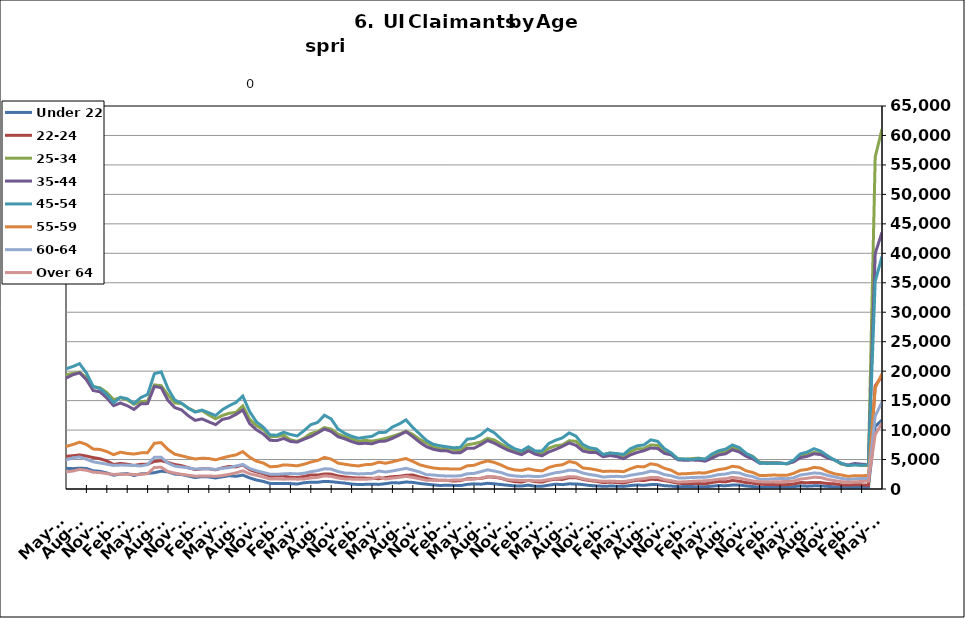
| Category | Under 22 | 22-24 | 25-34 | 35-44 | 45-54 | 55-59 | 60-64 | Over 64 |
|---|---|---|---|---|---|---|---|---|
| 1995-02-28 | 535 | 933 | 5740 | 6206 | 4029 | 1255 | 625 | 276 |
| 1995-03-31 | 534 | 992 | 5856 | 6433 | 4297 | 1294 | 686 | 323 |
| 1995-04-30 | 603 | 1125 | 6814 | 6965 | 4447 | 1392 | 730 | 338 |
| 1995-05-31 | 626 | 1171 | 7442 | 7404 | 4702 | 1383 | 751 | 333 |
| 1995-06-30 | 625 | 1218 | 7514 | 7778 | 4867 | 1435 | 813 | 366 |
| 1995-07-31 | 710 | 1296 | 8612 | 8864 | 5537 | 1595 | 891 | 407 |
| 1995-08-31 | 729 | 1248 | 8185 | 8719 | 5400 | 1604 | 982 | 406 |
| 1995-09-30 | 578 | 1028 | 6615 | 7150 | 4534 | 1351 | 862 | 338 |
| 1995-10-31 | 554 | 957 | 5805 | 6461 | 4159 | 1205 | 741 | 287 |
| 1995-11-30 | 468 | 845 | 5201 | 5826 | 3927 | 1155 | 702 | 254 |
| 1995-12-31 | 517 | 858 | 5350 | 5974 | 4010 | 1153 | 672 | 263 |
| 1996-01-31 | 543 | 927 | 5431 | 6086 | 4208 | 1221 | 685 | 301 |
| 1996-02-29 | 617 | 999 | 5667 | 6535 | 4480 | 1312 | 747 | 305 |
| 1996-03-31 | 622 | 981 | 5896 | 6557 | 4514 | 1362 | 763 | 306 |
| 1996-04-30 | 680 | 1140 | 7032 | 7649 | 5088 | 1527 | 856 | 345 |
| 1996-05-31 | 689 | 1163 | 7220 | 7819 | 5070 | 1521 | 832 | 366 |
| 1996-06-30 | 661 | 1145 | 7344 | 8173 | 5391 | 1568 | 844 | 388 |
| 1996-07-31 | 762 | 1250 | 8375 | 9181 | 6036 | 1755 | 973 | 432 |
| 1996-08-31 | 746 | 1145 | 7829 | 8585 | 5586 | 1651 | 950 | 435 |
| 1996-09-30 | 635 | 992 | 6399 | 7097 | 4790 | 1462 | 804 | 425 |
| 1996-10-31 | 572 | 851 | 5448 | 6291 | 4192 | 1259 | 693 | 340 |
| 1996-11-30 | 531 | 827 | 5003 | 5921 | 3908 | 1153 | 602 | 315 |
| 1996-12-31 | 521 | 789 | 4710 | 5510 | 3673 | 1110 | 610 | 284 |
| 1997-01-31 | 559 | 841 | 5203 | 6172 | 4321 | 1255 | 731 | 328 |
| 1997-02-28 | 556 | 841 | 5187 | 6162 | 4311 | 1250 | 727 | 326 |
| 1997-03-31 | 499 | 806 | 5125 | 6037 | 4176 | 1294 | 702 | 363 |
| 1997-04-30 | 545 | 885 | 5753 | 6709 | 4248 | 1339 | 734 | 339 |
| 1997-05-31 | 612 | 941 | 6146 | 7153 | 4458 | 1348 | 801 | 336 |
| 1997-06-30 | 623 | 995 | 6240 | 7298 | 4662 | 1302 | 776 | 348 |
| 1997-07-31 | 716 | 1154 | 7168 | 8554 | 5489 | 1509 | 903 | 415 |
| 1997-08-31 | 684 | 1072 | 6853 | 8093 | 5222 | 1487 | 837 | 416 |
| 1997-09-30 | 579 | 912 | 5522 | 6592 | 4348 | 1285 | 705 | 380 |
| 1997-10-31 | 516 | 817 | 4894.5 | 5892.5 | 3945 | 1159 | 625 | 344.5 |
| 1997-11-30 | 453 | 722 | 4267 | 5193 | 3542 | 1033 | 545 | 309 |
| 1997-12-31 | 413 | 682 | 3792 | 4755 | 3300 | 1023 | 490 | 266 |
| 1998-01-31 | 489 | 741 | 4044 | 5115 | 3513 | 1099 | 525 | 267 |
| 1998-02-28 | 435 | 684 | 3864 | 4903 | 3549 | 1043 | 571 | 285 |
| 1998-03-31 | 416 | 680 | 3855 | 5086 | 3703 | 1176 | 604 | 297 |
| 1998-04-30 | 592 | 813 | 5092 | 6219 | 4262 | 1336 | 688 | 332 |
| 1998-05-31 | 579 | 849 | 5319 | 6766 | 4554 | 1382 | 729 | 360 |
| 1998-06-30 | 568 | 899 | 5557 | 7101 | 4897 | 1405 | 783 | 367 |
| 1998-07-31 | 691 | 1031 | 6472 | 8095 | 5562 | 1589 | 880 | 392 |
| 1998-08-31 | 673 | 1007 | 6326 | 7950 | 5369 | 1574 | 935 | 393 |
| 1998-09-30 | 548 | 838 | 5206 | 6768 | 4703 | 1432 | 849 | 373 |
| 1998-10-31 | 496 | 776 | 4437 | 5582 | 3875 | 1250 | 711 | 302 |
| 1998-11-30 | 456 | 761 | 4182 | 5332 | 4015 | 1296 | 694 | 308 |
| 1998-12-31 | 442 | 722 | 4010 | 5198 | 4062 | 1331 | 656 | 290 |
| 1999-01-31 | 503 | 830 | 4502 | 5761 | 4521 | 1490 | 751 | 297 |
| 1999-02-28 | 463 | 756 | 4267 | 5576 | 4431 | 1470 | 767 | 301 |
| 1999-03-31 | 435 | 688 | 4119 | 5519 | 4403 | 1516 | 765 | 331 |
| 1999-04-30 | 591 | 949 | 5292 | 7089 | 5468 | 1724 | 914 | 489 |
| 1999-05-31 | 674 | 911 | 5611 | 7459 | 5457 | 1710 | 934 | 500 |
| 1999-06-30 | 640 | 906 | 5660 | 7503 | 5333 | 1695 | 920 | 495 |
| 1999-07-31 | 766 | 1132 | 6820 | 9256 | 6620 | 1981 | 1001 | 549 |
| 1999-08-31 | 738 | 1117 | 6737 | 9030 | 6670 | 2019 | 1075 | 582 |
| 1999-09-30 | 600 | 968 | 5167 | 7169 | 5458 | 1712 | 892 | 465 |
| 1999-10-31 | 494 | 813 | 4501 | 6048 | 4682 | 1443 | 743 | 363 |
| 1999-11-30 | 464 | 768 | 4228 | 5593 | 4564 | 1392 | 702 | 313 |
| 1999-12-31 | 468.5 | 754.5 | 4149 | 5486.5 | 4505 | 1429 | 673 | 304 |
| 2000-01-31 | 473 | 741 | 4070 | 5380 | 4446 | 1466 | 644 | 295 |
| 2000-02-29 | 460 | 691 | 3807 | 5357 | 4470 | 1469 | 707 | 310 |
| 2000-03-31 | 412 | 652 | 3864 | 5499 | 4568 | 1508 | 816 | 389 |
| 2000-04-30 | 585 | 829 | 4741 | 6891 | 5127 | 1631 | 906 | 451 |
| 2000-05-31 | 627 | 875 | 5086 | 7211 | 5238 | 1598 | 956 | 489 |
| 2000-06-30 | 675 | 983 | 5624 | 7826 | 5562 | 1669 | 941 | 524 |
| 2000-07-31 | 802 | 1109 | 6475 | 9102 | 6450 | 1927 | 1097 | 594 |
| 2000-08-31 | 787 | 1058 | 6045 | 8732 | 6157 | 1894 | 1085 | 616 |
| 2000-09-30 | 607 | 897 | 4766 | 6864 | 5037 | 1486 | 902 | 479 |
| 2000-10-31 | 544 | 760 | 4267 | 5897 | 4465 | 1323 | 762 | 394 |
| 2000-11-30 | 535 | 797 | 3982 | 5439 | 4318 | 1256 | 702 | 396 |
| 2000-12-31 | 508 | 832 | 3891 | 5255 | 4218 | 1246 | 694 | 361 |
| 2001-01-31 | 627 | 892 | 4229 | 5724 | 4777 | 1300 | 721 | 393 |
| 2001-02-28 | 643 | 934 | 4553 | 6302 | 5224 | 1529 | 849 | 472 |
| 2001-03-31 | 412 | 648 | 3625 | 5081 | 4551 | 1413 | 778 | 440 |
| 2001-04-30 | 875 | 1276 | 6577 | 8914 | 7196 | 2144 | 1185 | 639 |
| 2001-05-31 | 944 | 1399 | 7133 | 9570 | 7651 | 2265 | 1231 | 679 |
| 2001-06-30 | 1041 | 1584 | 8072 | 11034 | 8621 | 2613 | 1398 | 756 |
| 2001-07-31 | 1135 | 1806 | 9038 | 12514 | 9691 | 2970 | 1611 | 848 |
| 2001-08-31 | 1116 | 1776 | 8753 | 12045 | 9560 | 2963 | 1691 | 898 |
| 2001-09-30 | 1046 | 1705 | 8118 | 11025 | 8788 | 2784 | 1608 | 833 |
| 2001-10-31 | 1094 | 1785 | 8459 | 11114 | 8850 | 2772 | 1610 | 777 |
| 2001-11-30 | 1154 | 1931 | 9131 | 11576 | 9447 | 2973 | 1661 | 778 |
| 2001-12-31 | 1280 | 2191 | 9917 | 11961 | 9905 | 3152 | 1740 | 780 |
| 2002-01-31 | 1330 | 2255 | 10364 | 12730 | 10592 | 3378 | 1843 | 821 |
| 2002-02-28 | 1347 | 2339 | 10349 | 12730 | 10784 | 3499 | 1861 | 867 |
| 2002-03-31 | 1266 | 2231 | 9963 | 12747 | 10614 | 3499 | 1867 | 979 |
| 2002-04-30 | 1412 | 2488 | 11603 | 15825 | 13571 | 4631 | 2389 | 1146 |
| 2002-05-31 | 1455 | 2421 | 11243 | 15509 | 13148 | 4374 | 2359 | 1195 |
| 2002-06-30 | 1534 | 2479 | 11416 | 15594 | 13261 | 4343 | 2365 | 1180 |
| 2002-07-31 | 1513 | 2614 | 11895 | 16242 | 13727 | 4439 | 2428 | 1255 |
| 2002-08-31 | 1022 | 1977 | 8719 | 12054 | 10588 | 3454 | 1990 | 1047 |
| 2002-09-30 | 1391 | 2528 | 10478 | 14010 | 12008 | 3847 | 2161 | 1166 |
| 2002-10-31 | 1401 | 2385 | 9826 | 12727 | 10778 | 3498 | 1886 | 973 |
| 2002-11-30 | 1344 | 2390 | 9846 | 12059 | 10297 | 3367 | 1833 | 958 |
| 2002-12-31 | 1311 | 2403 | 9841 | 11670 | 10177 | 3369 | 1871 | 894 |
| 2003-01-31 | 1311 | 2403 | 9841 | 11670 | 10177 | 3369 | 1871 | 894 |
| 2003-02-28 | 1367 | 2275 | 9730 | 12433 | 10806 | 3687 | 2016 | 974 |
| 2003-03-31 | 1367 | 2357 | 9844 | 12620 | 11167 | 3825 | 2151 | 1094 |
| 2003-04-30 | 1549 | 2525 | 10619 | 14142 | 12182 | 4004 | 2304 | 1190 |
| 2003-05-31 | 1663 | 2698 | 10843 | 14795 | 12539 | 4102 | 2395 | 1256 |
| 2003-06-30 | 1755 | 2770 | 11350 | 15575 | 13251 | 4301 | 2493 | 1325 |
| 2003-07-31 | 1748 | 2791 | 11577 | 15863 | 13772 | 4465 | 2593 | 1371 |
| 2003-08-31 | 1718 | 2653 | 10998 | 15261 | 13219 | 4325 | 2522 | 1359 |
| 2003-09-30 | 1494 | 2521 | 10071 | 13565 | 11659 | 3828 | 2278 | 1286 |
| 2003-10-31 | 1329 | 2432 | 9388 | 12107 | 10693 | 3567 | 2036 | 1129 |
| 2003-11-30 | 1191 | 2226 | 8954 | 11297 | 10037 | 3414 | 2004 | 1068 |
| 2003-12-31 | 1206 | 2184 | 8530 | 10413 | 9335 | 3215 | 1854 | 994 |
| 2004-01-31 | 1216 | 2171 | 8382 | 9858 | 8955 | 2992 | 1736 | 963 |
| 2004-02-29 | 1118 | 1879 | 7614 | 8935 | 8176 | 2761 | 1617 | 943 |
| 2004-03-31 | 1099 | 1749 | 7152 | 8565 | 7769 | 2686 | 1608 | 981 |
| 2004-04-30 | 1241 | 1951 | 7653 | 9981 | 8741 | 2872 | 1685 | 1056 |
| 2004-05-31 | 1245 | 1934 | 7651 | 10203 | 8820 | 2928 | 1703 | 1079 |
| 2004-06-30 | 1316 | 2086 | 8172 | 10636 | 9362 | 3146 | 1843 | 1081 |
| 2004-07-31 | 1476 | 2265 | 8795 | 11511 | 10439 | 3497 | 2008 | 1171 |
| 2004-08-31 | 1390 | 2055 | 8008 | 10418 | 9514 | 3304 | 1909 | 1105 |
| 2004-09-30 | 1129 | 1820 | 6987 | 8661 | 7694 | 2755 | 1623 | 1046 |
| 2004-10-31 | 1037 | 1675 | 6590 | 7964 | 7029 | 2459 | 1461 | 882 |
| 2004-11-30 | 954 | 1638 | 6342 | 7570 | 6733 | 2294 | 1383 | 841 |
| 2004-12-31 | 857 | 1533 | 5921 | 6991 | 6333 | 2225 | 1287 | 764 |
| 2005-01-31 | 893 | 1539 | 6047 | 7410 | 6682 | 2253 | 1274 | 788 |
| 2005-02-28 | 846 | 1361 | 5650 | 6952 | 6404 | 2198 | 1326 | 786 |
| 2005-03-31 | 747 | 1258 | 5313 | 6595 | 6251 | 2151 | 1327 | 742 |
| 2005-04-30 | 877 | 1375 | 5696 | 7717 | 7230 | 2440 | 1401 | 844 |
| 2005-05-31 | 854 | 1408 | 5674 | 7905 | 7454 | 2482 | 1453 | 858 |
| 2005-06-30 | 819 | 1444 | 6028 | 8565 | 7899 | 2613 | 1547 | 890 |
| 2005-07-31 | 900 | 1461 | 6395 | 9124 | 8614 | 2864 | 1640 | 1004 |
| 2005-08-31 | 805 | 1439 | 5917 | 8271 | 8076 | 2692 | 1587 | 945 |
| 2005-09-30 | 631 | 1209 | 4978 | 6413 | 6203 | 2116 | 1312 | 724 |
| 2005-10-31 | 638 | 1134 | 4602 | 6028 | 5688 | 1997 | 1171 | 656 |
| 2005-11-30 | 564 | 1071 | 4409 | 5563 | 5105 | 1791 | 1035 | 580 |
| 2005-12-31 | 523 | 987 | 4014 | 4983 | 4531 | 1673 | 968 | 546 |
| 2006-01-31 | 531 | 925 | 3900 | 5012 | 4793 | 1691 | 1008 | 539 |
| 2006-02-28 | 447 | 804 | 3534 | 4388 | 4403 | 1586 | 980 | 549 |
| 2006-03-31 | 399 | 785 | 3455 | 4472 | 4584 | 1680 | 1069 | 618 |
| 2006-04-30 | 527 | 945 | 4004 | 5859 | 5921 | 1965 | 1251 | 744 |
| 2006-05-31 | 594 | 964 | 4205 | 6365 | 6369 | 2156 | 1327 | 792 |
| 2006-06-30 | 660 | 1113 | 4742 | 7052 | 7094 | 2386 | 1474 | 933 |
| 2006-07-31 | 771 | 1183 | 5214 | 7974 | 8007 | 2685 | 1635 | 1072 |
| 2006-08-31 | 737 | 1202 | 5116 | 7524 | 7553 | 2671 | 1590 | 1019 |
| 2006-09-30 | 596 | 1086 | 4608 | 6175 | 6389 | 2256 | 1287 | 812 |
| 2006-10-31 | 596 | 1056 | 4585 | 5758 | 5788 | 2026 | 1164 | 696 |
| 2006-11-30 | 542 | 1003 | 4370 | 5304 | 5388 | 1812 | 1082 | 604 |
| 2006-12-31 | 553 | 1102 | 4425 | 5291 | 5310 | 1801 | 1099 | 603 |
| 2007-01-31 | 587 | 1147 | 4542 | 5619 | 5506 | 1920 | 1174 | 663 |
| 2007-02-28 | 544 | 1090 | 4490 | 5562 | 5616 | 1982 | 1260 | 705 |
| 2007-03-31 | 558 | 1089 | 4498 | 5595 | 5708 | 2016 | 1378 | 717 |
| 2007-04-30 | 760 | 1203 | 5015 | 6827 | 6871 | 2316 | 1536 | 856 |
| 2007-05-31 | 806 | 1285 | 5542 | 7679 | 7763 | 2571 | 1719 | 1021 |
| 2007-06-30 | 862 | 1340 | 6100 | 8324 | 8341 | 2812 | 1896 | 1060 |
| 2007-07-31 | 980 | 1524 | 6616 | 9184 | 9522 | 3226 | 2038 | 1250 |
| 2007-08-31 | 950 | 1510 | 6266 | 8359 | 8842 | 3033 | 1949 | 1157 |
| 2007-09-30 | 865 | 1595 | 6213 | 7798 | 7957 | 2790 | 1816 | 1090 |
| 2007-10-31 | 883 | 1517 | 6214 | 7229 | 7503 | 2574 | 1630 | 978 |
| 2007-11-15 | 816 | 1424 | 5981 | 6740 | 6999 | 2468 | 1510 | 860 |
| 2007-12-15 09:36:00 | 851 | 1536 | 6411 | 6986 | 7174 | 2572 | 1584 | 874 |
| 2008-01-14 19:12:00 | 963 | 1628 | 6836 | 7533 | 7742 | 2786 | 1744 | 940 |
| 2008-02-14 04:48:00 | 982 | 1565 | 6847 | 7767 | 8031 | 2958 | 1823 | 985 |
| 2008-03-15 14:24:00 | 1029 | 1666 | 7210 | 8036 | 8353 | 3105 | 1898 | 1085 |
| 2008-04-15 | 1182 | 1889 | 7894 | 9339 | 9822 | 3537 | 2184 | 1246 |
| 2008-05-15 09:36:00 | 1325 | 2099 | 8651 | 10315 | 11003 | 3871 | 2423 | 1448 |
| 2008-06-14 19:12:00 | 1405 | 2238 | 9567 | 11330 | 12040 | 4322 | 2650 | 1572 |
| 2008-07-15 04:48:00 | 1616 | 2488 | 10336 | 12349 | 13396 | 4698 | 3083 | 1801 |
| 2008-08-14 14:24:00 | 1753 | 2665 | 10716 | 12486 | 13444 | 4795 | 3139 | 1802 |
| 2008-09-14 | 1800 | 2924 | 11552 | 12686 | 13602 | 4801 | 3180 | 1811 |
| 2008-10-14 09:36:00 | 1936 | 3131 | 12284 | 13322 | 13831 | 4989 | 3183 | 1808 |
| 2008-11-13 19:12:00 | 2093 | 3414 | 13577 | 14724 | 15130 | 5413 | 3440 | 1946 |
| 2008-12-14 04:48:00 | 2495 | 4020 | 15380 | 16325 | 16846 | 6098 | 3755 | 2155 |
| 2009-01-13 14:24:00 | 3054 | 4678 | 17678 | 18452 | 19095 | 6788 | 4182 | 2364 |
| 2009-02-13 | 3531 | 5304 | 19793 | 20788 | 21601 | 7727 | 4836 | 2718 |
| 2009-03-15 09:36:00 | 3891 | 5925 | 22303 | 23139 | 24352 | 8876 | 5515 | 3141 |
| 2009-04-14 19:12:00 | 4291 | 6403 | 23925 | 25362 | 26817 | 9618 | 6020 | 3494 |
| 2009-05-15 04:48:00 | 4410 | 6521 | 24301 | 25794 | 27238 | 9735 | 6181 | 3529 |
| 2009-06-14 14:24:00 | 4405 | 6853 | 25234 | 26806 | 28296 | 10256 | 6673 | 3804 |
| 2009-07-15 | 4729 | 7280 | 26132 | 27836 | 29724 | 10830 | 6950 | 4125 |
| 2009-08-14 09:36:00 | 4717 | 7069 | 25281 | 26184 | 27877 | 10164 | 6719 | 3918 |
| 2009-09-13 19:12:00 | 4741 | 7291 | 25029 | 24981 | 26018 | 9679 | 6210 | 3594 |
| 2009-10-14 04:48:00 | 4656 | 7051 | 24241 | 23779 | 24730 | 9034 | 5817 | 3422 |
| 2009-11-13 14:24:00 | 4421 | 6817 | 23760 | 22851 | 23515 | 8627 | 5549 | 3297 |
| 2009-12-14 | 4232 | 6586 | 23118 | 22038 | 22501 | 8496 | 5370 | 3295 |
| 2010-01-13 09:36:00 | 4276 | 6583 | 22706 | 21421 | 22132 | 8135 | 5154 | 3134 |
| 2010-02-12 19:12:00 | 4133 | 6142 | 21386 | 20012 | 21036 | 7728 | 5039 | 3047 |
| 2010-03-15 04:48:00 | 3784 | 5822 | 20418 | 19073 | 20556 | 7446 | 4983 | 3062 |
| 2010-04-14 14:24:00 | 3731 | 5751 | 20058 | 19261 | 21012 | 7449 | 5078 | 2936 |
| 2010-05-15 | 3516 | 5553 | 19393 | 18793 | 20409 | 7213 | 4923 | 2915 |
| 2010-06-14 09:36:00 | 3450 | 5640 | 19615 | 19385 | 20781 | 7547 | 5293 | 3043 |
| 2010-07-14 19:12:00 | 3536 | 5781 | 19820 | 19714 | 21269 | 7946 | 5439 | 3330 |
| 2010-08-14 04:48:00 | 3477 | 5590 | 18902 | 18548 | 19686 | 7561 | 5039 | 3181 |
| 2010-09-13 14:24:00 | 3083 | 5332 | 17344 | 16712 | 17408 | 6775 | 4612 | 2859 |
| 2010-10-14 | 3004 | 5138 | 17187 | 16492 | 17042 | 6713 | 4418 | 2779 |
| 2010-11-13 09:36:00 | 2724 | 4771 | 16387 | 15438 | 16061 | 6360 | 4209 | 2601 |
| 2010-12-13 19:12:00 | 2335 | 4159 | 15175 | 14143 | 14646 | 5823 | 4003 | 2480 |
| 2011-01-13 04:48:00 | 2530 | 4343 | 15492 | 14596 | 15561 | 6250 | 4059 | 2487 |
| 2011-02-12 14:24:00 | 2609 | 4202 | 15131 | 14142 | 15320 | 6044 | 4041 | 2517 |
| 2011-03-15 | 2290 | 3998 | 14370 | 13505 | 14523 | 5925 | 3990 | 2470 |
| 2011-04-14 09:36:00 | 2563 | 4190 | 14834 | 14445 | 15508 | 6130 | 3916 | 2488 |
| 2011-05-14 19:12:00 | 2642 | 4217 | 14917 | 14494 | 16051 | 6156 | 4129 | 2602 |
| 2011-06-14 04:48:00 | 2767 | 4676 | 17673 | 17404 | 19563 | 7763 | 5398 | 3653 |
| 2011-07-14 14:24:00 | 3027 | 4815 | 17530 | 17197 | 19880 | 7870 | 5384 | 3686 |
| 2011-08-14 | 2900 | 4498 | 15970 | 15020 | 17035 | 6697 | 4394 | 2956 |
| 2011-09-13 09:36:00 | 2531 | 4156 | 14609 | 13818 | 15092 | 5903 | 3881 | 2687 |
| 2011-10-13 19:12:00 | 2452 | 3959 | 14501 | 13415 | 14565 | 5635 | 3734 | 2491 |
| 2011-11-13 04:48:00 | 2197 | 3615 | 13732 | 12410 | 13698 | 5345 | 3574 | 2339 |
| 2011-12-13 14:24:00 | 1938 | 3290 | 13130 | 11646 | 13054 | 5089 | 3380 | 2177 |
| 2012-01-13 | 2098 | 3424 | 13293 | 11897 | 13400 | 5218 | 3448 | 2197 |
| 2012-02-12 09:36:00 | 2047 | 3428 | 12569 | 11400 | 12931 | 5177 | 3445 | 2212 |
| 2012-03-13 19:12:00 | 1870 | 3252 | 11913 | 10922 | 12476 | 4948 | 3317 | 2155 |
| 2012-04-13 04:48:00 | 2063 | 3590 | 12479 | 11814 | 13464 | 5278 | 3509 | 2287 |
| 2012-05-13 14:24:00 | 2260 | 3828 | 12852 | 12063 | 14139 | 5562 | 3628 | 2485 |
| 2012-06-13 | 2147 | 3747 | 13008 | 12659 | 14694 | 5791 | 3902 | 2736 |
| 2012-07-13 09:36:00 | 2358 | 4087 | 14109 | 13412 | 15770 | 6346 | 4156 | 3086 |
| 2012-08-12 19:12:00 | 1887 | 3284 | 11852 | 11102 | 13153 | 5396 | 3487 | 2583 |
| 2012-09-12 04:48:00 | 1524 | 2903 | 10742 | 10051 | 11393 | 4726 | 3103 | 2327 |
| 2012-10-12 14:24:00 | 1289 | 2603 | 10123 | 9339 | 10510 | 4405 | 2813 | 2032 |
| 2012-11-12 | 945 | 2155 | 8870 | 8273 | 9193 | 3781 | 2520 | 1702 |
| 2012-12-12 09:36:00 | 937 | 2201 | 8913 | 8210 | 9124 | 3816 | 2491 | 1722 |
| 2013-01-11 19:12:00 | 934 | 2199 | 9132 | 8579 | 9635 | 4095 | 2569 | 1667 |
| 2013-02-11 04:48:00 | 915 | 1996 | 8343 | 8072 | 9253 | 4034 | 2623 | 1715 |
| 2013-03-13 14:24:00 | 845 | 1934 | 8092 | 7955 | 9007 | 3929 | 2561 | 1667 |
| 2013-04-13 | 1055 | 2124 | 8637 | 8445 | 9891 | 4204 | 2666 | 1698 |
| 2013-05-13 09:36:00 | 1160 | 2394 | 9413 | 8898 | 10920 | 4574 | 2940 | 1871 |
| 2013-06-12 19:12:00 | 1145 | 2351 | 9732 | 9510 | 11293 | 4830 | 3115 | 1976 |
| 2013-07-13 04:48:00 | 1294 | 2558 | 10421 | 10174 | 12520 | 5363 | 3434 | 2233 |
| 2013-08-12 14:24:00 | 1238 | 2519 | 10150 | 9771 | 11886 | 5067 | 3372 | 2140 |
| 2013-09-12 | 1116 | 2214 | 9323 | 8874 | 10178 | 4389 | 2964 | 1871 |
| 2013-10-12 09:36:00 | 1000 | 2044 | 8893 | 8509 | 9449 | 4200 | 2701 | 1709 |
| 2013-11-11 19:12:00 | 842 | 1927 | 8532 | 8049 | 8950 | 4028 | 2665 | 1675 |
| 2013-12-12 04:48:00 | 753 | 1854 | 8098 | 7692 | 8612 | 3913 | 2557 | 1655 |
| 2014-01-11 14:24:00 | 788 | 1846 | 8270 | 7762 | 8786 | 4128 | 2606 | 1642 |
| 2014-02-11 | 795 | 1817 | 8124 | 7677 | 8944 | 4189 | 2646 | 1728 |
| 2014-03-13 09:36:00 | 782 | 1741 | 8319 | 8063 | 9583 | 4550 | 3048 | 2040 |
| 2014-04-12 19:12:00 | 905 | 1940 | 8594 | 8138 | 9620 | 4372 | 2886 | 1706 |
| 2014-05-13 04:48:00 | 1079 | 2093 | 8933 | 8593 | 10522 | 4609 | 3062 | 1850 |
| 2014-06-12 14:24:00 | 1028 | 2152 | 9323 | 9148 | 11040 | 4920 | 3274 | 1985 |
| 2014-07-13 | 1189 | 2333 | 9808 | 9735 | 11729 | 5171 | 3509 | 2133 |
| 2014-08-14 | 1119 | 2379 | 9259 | 8876 | 10438 | 4678 | 3210 | 1962 |
| 2014-09-13 09:36:00 | 943 | 2048 | 8430 | 7946 | 9358 | 4119 | 2891 | 1734 |
| 2014-10-13 19:12:00 | 816 | 1781 | 7821 | 7185 | 8244 | 3813 | 2437 | 1486 |
| 2014-11-13 04:48:00 | 703 | 1557 | 7150 | 6736 | 7594 | 3571 | 2374 | 1466 |
| 2014-12-13 14:24:00 | 597 | 1482 | 6833 | 6507 | 7340 | 3442 | 2255 | 1458 |
| 2015-01-13 | 646 | 1466 | 6927 | 6477 | 7168 | 3432 | 2210 | 1429 |
| 2015-02-12 09:36:00 | 607 | 1346 | 6696 | 6134 | 6999 | 3383 | 2220 | 1525 |
| 2015-03-14 19:12:00 | 577 | 1416 | 6499 | 6145 | 7077 | 3405 | 2233 | 1530 |
| 2015-04-14 04:48:00 | 784 | 1736 | 7505 | 6901 | 8468 | 3935 | 2586 | 1624 |
| 2015-05-14 14:24:00 | 875 | 1749 | 7696 | 6925 | 8578 | 4020 | 2644 | 1698 |
| 2015-06-14 | 818 | 1789 | 7961 | 7519 | 9200 | 4452 | 2943 | 1839 |
| 2015-07-14 09:36:00 | 966 | 2033 | 8609 | 8223 | 10167 | 4766 | 3254 | 2136 |
| 2015-08-13 19:12:00 | 880 | 2007 | 8302 | 7779 | 9530 | 4503 | 3045 | 2073 |
| 2015-09-13 04:48:00 | 752 | 1807 | 7615 | 7153 | 8455 | 4067 | 2798 | 1870 |
| 2015-10-13 14:24:00 | 630 | 1461 | 6995 | 6578 | 7509 | 3519 | 2375 | 1570 |
| 2015-11-13 | 533 | 1246 | 6491 | 6196 | 6815 | 3237 | 2224 | 1493 |
| 2015-12-13 09:36:00 | 512 | 1179 | 6242 | 5823 | 6474 | 3158 | 2123 | 1439 |
| 2016-01-12 19:12:00 | 646 | 1466 | 6927 | 6477 | 7168 | 3432 | 2210 | 1429 |
| 2016-02-12 04:48:00 | 482 | 1246 | 6101 | 5912 | 6452 | 3180 | 2110 | 1385 |
| 2016-03-13 14:24:00 | 474 | 1170 | 6011 | 5629 | 6452 | 3073 | 2152 | 1420 |
| 2016-04-13 | 648 | 1494 | 6917 | 6287 | 7737 | 3648 | 2483 | 1600 |
| 2016-05-13 09:36:00 | 812 | 1670 | 7326 | 6725 | 8279 | 3967 | 2765 | 1776 |
| 2016-06-12 19:12:00 | 738 | 1622 | 7479 | 7230 | 8681 | 4111 | 2920 | 1886 |
| 2016-07-13 04:48:00 | 875 | 1919 | 8193 | 7814 | 9525 | 4662 | 3196 | 2105 |
| 2016-08-12 14:24:00 | 858 | 1920 | 8091 | 7407 | 8969 | 4420 | 3130 | 2050 |
| 2016-09-12 | 752 | 1632 | 6992 | 6450 | 7548 | 3573 | 2713 | 1747 |
| 2016-10-12 09:36:00 | 602 | 1423 | 6590 | 6190 | 6998 | 3448 | 2457 | 1544 |
| 2016-11-11 19:12:00 | 523 | 1296 | 6418 | 6179 | 6801 | 3241 | 2299 | 1410 |
| 2016-12-12 04:48:00 | 468 | 1096 | 5827 | 5472 | 5867 | 2981 | 2019 | 1311 |
| 2017-01-11 14:24:00 | 495 | 1150 | 6111 | 5679 | 6108 | 3035 | 2115 | 1342 |
| 2017-02-11 | 484 | 1109 | 5882 | 5500 | 6023 | 3023 | 2148 | 1289 |
| 2017-03-13 09:36:00 | 442 | 1015 | 5634 | 5148 | 5865 | 2942 | 2075 | 1278 |
| 2017-04-12 19:12:00 | 585 | 1285 | 6292 | 5783 | 6842 | 3434 | 2336 | 1435 |
| 2017-05-13 04:48:00 | 686 | 1492 | 6844 | 6200 | 7332 | 3817 | 2526 | 1637 |
| 2017-06-12 14:24:00 | 623 | 1435 | 6852 | 6505 | 7473 | 3751 | 2713 | 1754 |
| 2017-07-13 | 745 | 1658 | 7483 | 6953 | 8339 | 4284 | 3038 | 1964 |
| 2017-08-12 09:36:00 | 745 | 1605 | 7411 | 6880 | 8092 | 4080 | 2878 | 1966 |
| 2017-09-11 19:12:00 | 559 | 1420 | 6481 | 6045 | 6845 | 3511 | 2443 | 1591 |
| 2017-10-12 04:48:00 | 503 | 1224 | 5960 | 5790 | 6135 | 3181 | 2245 | 1400 |
| 2017-11-11 14:24:00 | 390 | 972 | 5167 | 4951 | 5077 | 2553 | 1887 | 1188 |
| 2017-12-12 | 413 | 914 | 5058 | 4876 | 5071 | 2585 | 1870 | 1226 |
| 2018-01-11 09:36:00 | 411 | 912 | 5154 | 4909 | 5000 | 2656 | 1952 | 1288 |
| 2018-02-10 19:12:00 | 383 | 940 | 5246 | 4884 | 5165 | 2743 | 1980 | 1355 |
| 2018-03-13 04:48:00 | 373 | 875 | 5018 | 4724 | 5075 | 2723 | 1999 | 1389 |
| 2018-04-12 14:24:00 | 478 | 1104 | 5584 | 5240 | 5944 | 3026 | 2179 | 1506 |
| 2018-05-13 | 586 | 1275 | 6280 | 5780 | 6500 | 3300 | 2452 | 1670 |
| 2018-06-12 09:36:00 | 554 | 1207 | 6302 | 5974 | 6766 | 3462 | 2534 | 1762 |
| 2018-07-12 19:12:00 | 666 | 1445 | 7024 | 6656 | 7473 | 3858 | 2810 | 1989 |
| 2018-08-12 04:48:00 | 671 | 1323 | 6823 | 6293 | 7046 | 3706 | 2722 | 1850 |
| 2018-09-11 14:24:00 | 518 | 1084 | 5965 | 5563 | 6066 | 3091 | 2318 | 1618 |
| 2018-10-12 | 419 | 985 | 5538 | 5106 | 5464 | 2806 | 2102 | 1367 |
| 2018-11-11 09:36:00 | 306 | 808 | 4542 | 4371 | 4433 | 2297 | 1673 | 1222 |
| 2018-12-11 19:12:00 | 328 | 771 | 4439 | 4429 | 4340 | 2303 | 1646 | 1174 |
| 2019-01-11 04:48:00 | 327 | 743 | 4491 | 4378 | 4359 | 2368 | 1715 | 1218 |
| 2019-02-10 14:24:00 | 338 | 739 | 4402 | 4415 | 4345 | 2337 | 1773 | 1237 |
| 2019-03-13 | 306 | 738 | 4246 | 4293 | 4304 | 2328 | 1756 | 1281 |
| 2019-04-12 09:36:00 | 396 | 850 | 4657 | 4603 | 4871 | 2655 | 1900 | 1347 |
| 2019-05-12 19:12:00 | 541 | 1092 | 5700 | 5319 | 5974 | 3169 | 2371 | 1690 |
| 2019-06-12 04:48:00 | 476 | 1070 | 5822 | 5537 | 6262 | 3317 | 2534 | 1820 |
| 2019-07-12 14:24:00 | 538 | 1114 | 6206 | 5980 | 6836 | 3673 | 2717 | 1996 |
| 2019-08-12 | 528 | 1084 | 6044 | 5828 | 6422 | 3535 | 2645 | 1942 |
| 2019-09-11 09:36:00 | 445 | 932 | 5379 | 5275 | 5630 | 2979 | 2299 | 1624 |
| 2019-10-11 19:12:00 | 372 | 877 | 4949 | 4938 | 4922 | 2579 | 2058 | 1418 |
| 2019-11-11 04:48:00 | 332 | 701 | 4242 | 4332 | 4379 | 2392 | 1809 | 1247 |
| 2019-12-11 14:24:00 | 261 | 663 | 3977 | 4071 | 3974 | 2137 | 1619 | 1150 |
| 2020-01-11 | 272 | 724 | 4153 | 4331 | 4085 | 2258 | 1715 | 1206 |
| 2020-02-10 09:36:00 | 274 | 704 | 3992 | 4211 | 4020 | 2226 | 1784 | 1286 |
| 2020-03-11 19:12:00 | 291 | 630 | 3985 | 4153 | 4136 | 2332 | 1794 | 1308 |
| 2020-04-11 04:48:00 | 10628 | 17510 | 56346 | 39970 | 35225 | 17140 | 12379 | 9237 |
| 2020-05-11 14:24:00 | 11700 | 19159 | 61067 | 43562 | 39459 | 19553 | 14765 | 11197 |